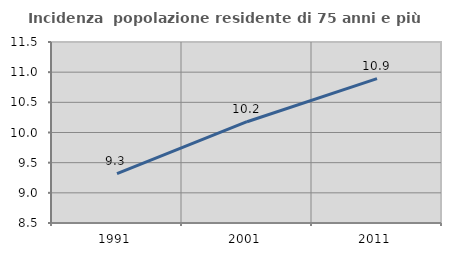
| Category | Incidenza  popolazione residente di 75 anni e più |
|---|---|
| 1991.0 | 9.318 |
| 2001.0 | 10.179 |
| 2011.0 | 10.893 |